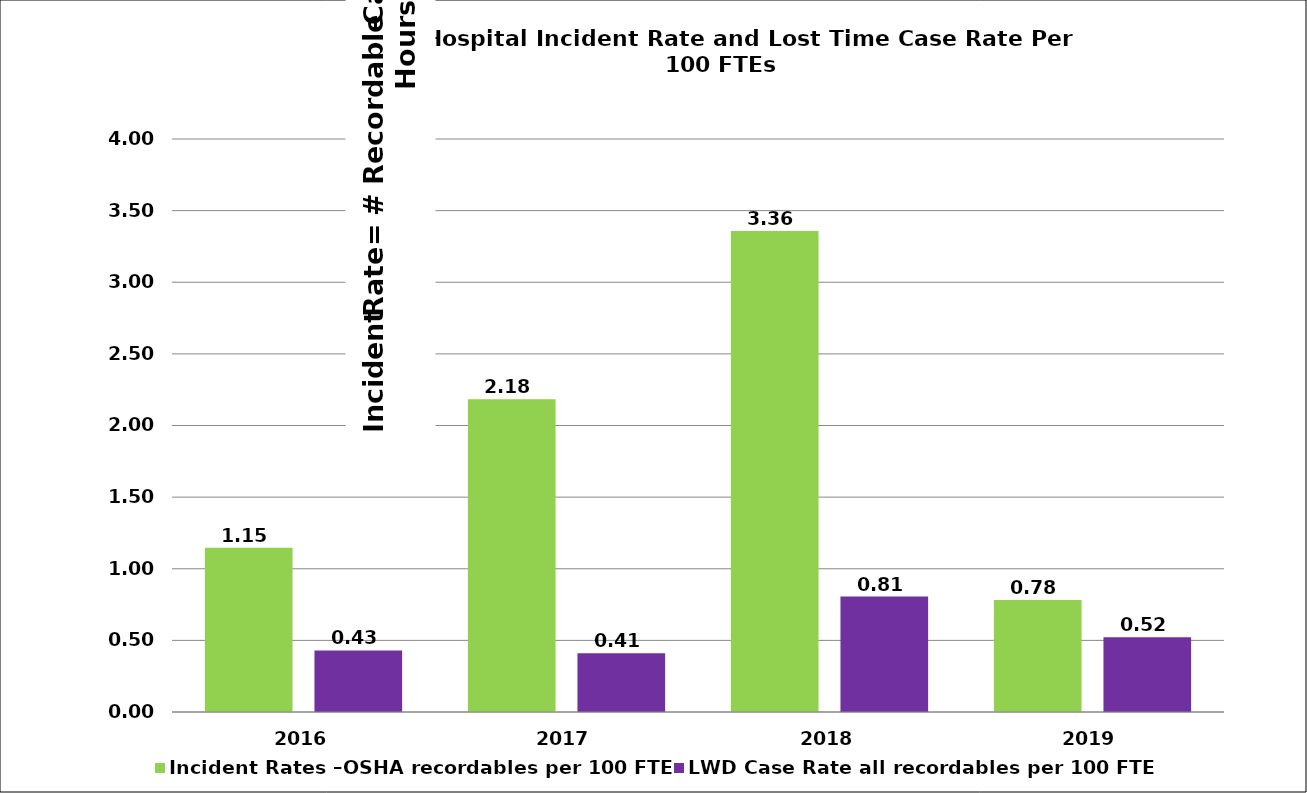
| Category | Incident Rates –OSHA recordables per 100 FTE | LWD Case Rate all recordables per 100 FTE |
|---|---|---|
| 2016.0 | 1.146 | 0.43 |
| 2017.0 | 2.184 | 0.41 |
| 2018.0 | 3.358 | 0.806 |
| 2019.0 | 0.782 | 0.521 |